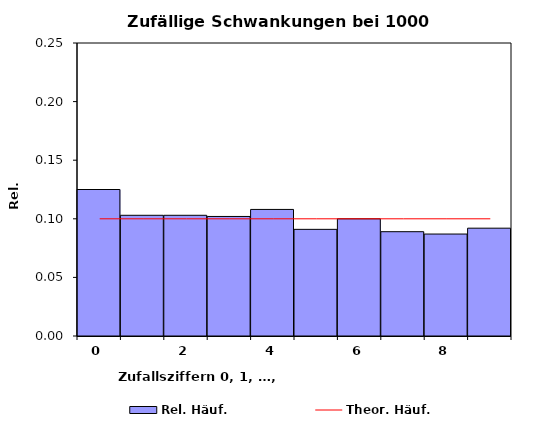
| Category | Rel. Häuf. |
|---|---|
| 0.0 | 0.125 |
| 1.0 | 0.103 |
| 2.0 | 0.103 |
| 3.0 | 0.102 |
| 4.0 | 0.108 |
| 5.0 | 0.091 |
| 6.0 | 0.1 |
| 7.0 | 0.089 |
| 8.0 | 0.087 |
| 9.0 | 0.092 |